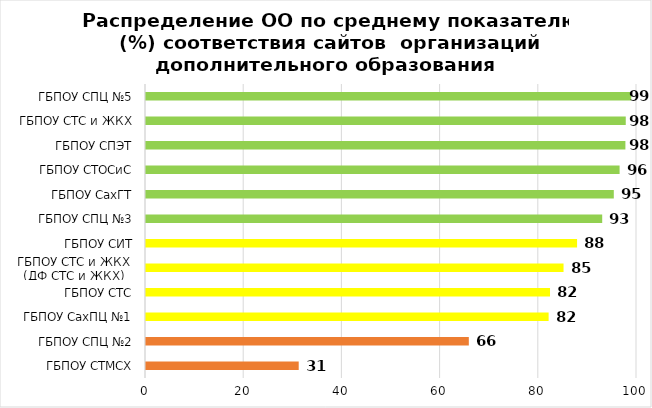
| Category | Series 0 |
|---|---|
| ГБПОУ СТМСХ | 31.102 |
| ГБПОУ СПЦ №2 | 65.748 |
| ГБПОУ СахПЦ №1 | 82 |
| ГБПОУ СТС | 82.283 |
| ГБПОУ СТС и ЖКХ
(ДФ СТС и ЖКХ) | 85.039 |
| ГБПОУ СИТ | 87.795 |
| ГБПОУ СПЦ №3 | 92.913 |
| ГБПОУ СахГТ | 95.276 |
| ГБПОУ СТОСиС | 96.457 |
| ГБПОУ СПЭТ | 97.638 |
| ГБПОУ СТС и ЖКХ | 97.71 |
| ГБПОУ СПЦ №5 | 98.819 |